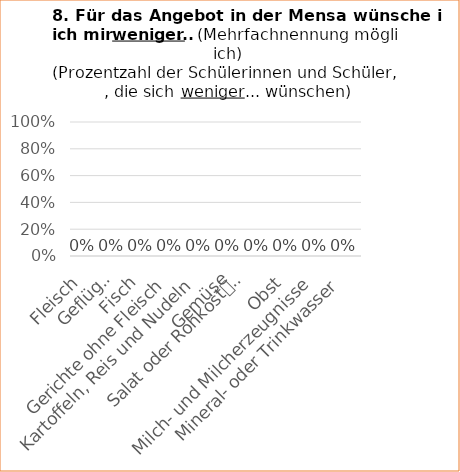
| Category | Series 1 |
|---|---|
| Fleisch | 0 |
| Geflügel | 0 |
| Fisch | 0 |
| Gerichte ohne Fleisch | 0 |
| Kartoffeln, Reis und Nudeln | 0 |
| Gemüse | 0 |
| Salat oder Rohkost
(z. B. Karotten-Sticks) | 0 |
| Obst | 0 |
| Milch- und Milcherzeugnisse | 0 |
| Mineral- oder Trinkwasser | 0 |